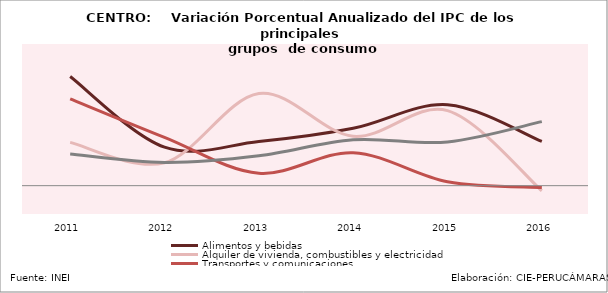
| Category | Alimentos y bebidas | Alquiler de vivienda, combustibles y electricidad | Transportes y comunicaciones | Esparcimiento,  servicios culturales y de enseñanza | 5.5% 2.5% 2.8% 3.5% 4.2% 2.8% |
|---|---|---|---|---|---|
| 2011.0 | 0.077 | 0.031 | 0.061 | 0.022 |  |
| 2012.0 | 0.027 | 0.016 | 0.034 | 0.016 |  |
| 2013.0 | 0.031 | 0.065 | 0.009 | 0.021 |  |
| 2014.0 | 0.04 | 0.035 | 0.023 | 0.032 |  |
| 2015.0 | 0.057 | 0.053 | 0.003 | 0.031 |  |
| 2016.0 | 0.031 | -0.004 | -0.001 | 0.045 |  |